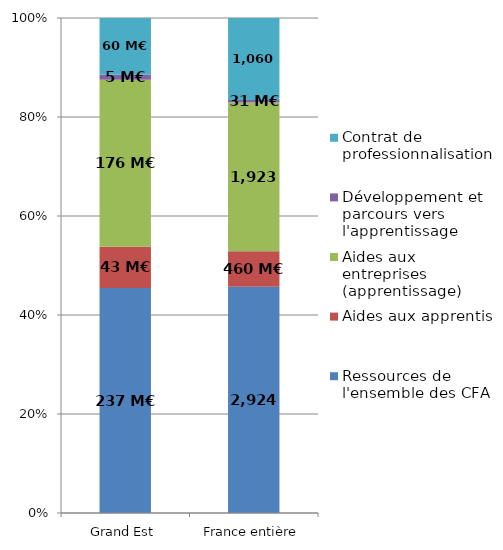
| Category | Ressources de l'ensemble des CFA | Aides aux apprentis | Aides aux entreprises (apprentissage) | Développement et parcours vers l'apprentissage | Contrat de professionnalisation |
|---|---|---|---|---|---|
| Grand Est | 236.774 | 43.416 | 175.9 | 5.308 | 59.657 |
| France entière | 2924.219 | 459.796 | 1923.184 | 31.421 | 1060.48 |